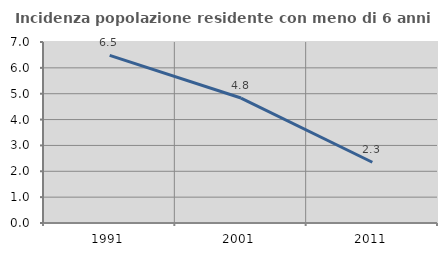
| Category | Incidenza popolazione residente con meno di 6 anni |
|---|---|
| 1991.0 | 6.48 |
| 2001.0 | 4.833 |
| 2011.0 | 2.35 |